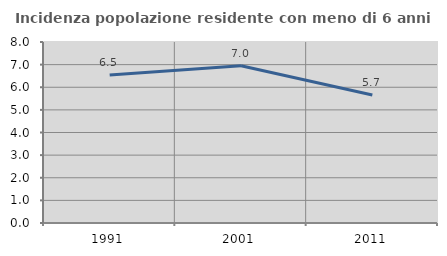
| Category | Incidenza popolazione residente con meno di 6 anni |
|---|---|
| 1991.0 | 6.544 |
| 2001.0 | 6.951 |
| 2011.0 | 5.657 |